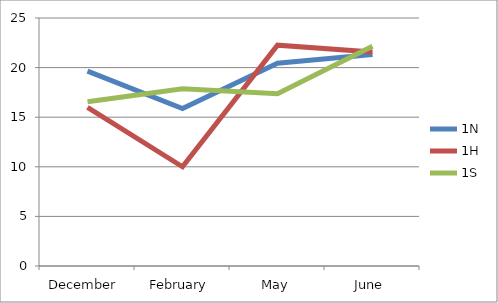
| Category | 1N | 1H | 1S |
|---|---|---|---|
| December  | 19.648 | 15.986 | 16.551 |
| February | 15.875 | 10 | 17.862 |
| May | 20.432 | 22.264 | 17.364 |
| June | 21.316 | 21.577 | 22.147 |